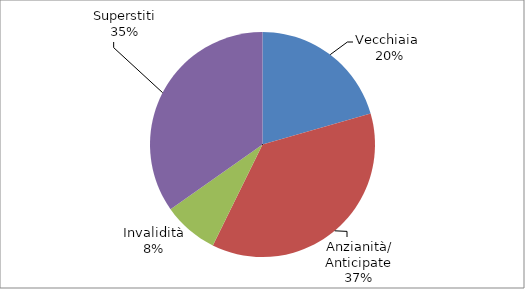
| Category | Series 0 |
|---|---|
| Vecchiaia  | 14356 |
| Anzianità/ Anticipate | 25652 |
| Invalidità | 5554 |
| Superstiti | 24285 |